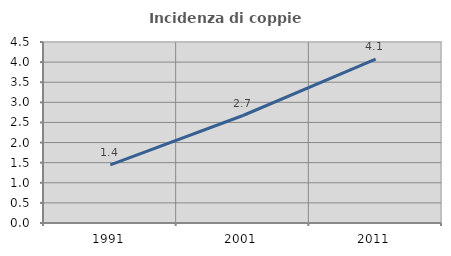
| Category | Incidenza di coppie miste |
|---|---|
| 1991.0 | 1.447 |
| 2001.0 | 2.673 |
| 2011.0 | 4.076 |